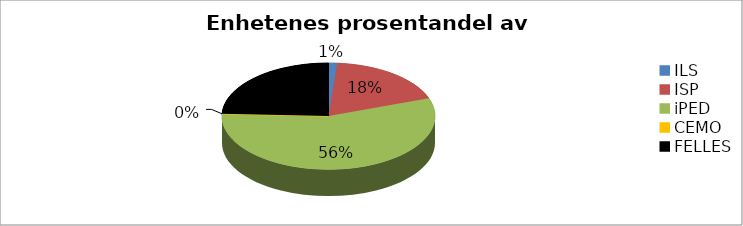
| Category | Series 0 |
|---|---|
| ILS | 19096 |
| ISP | 263558.568 |
| iPED | 813712.144 |
| CEMO | 0 |
| FELLES | 352248.736 |